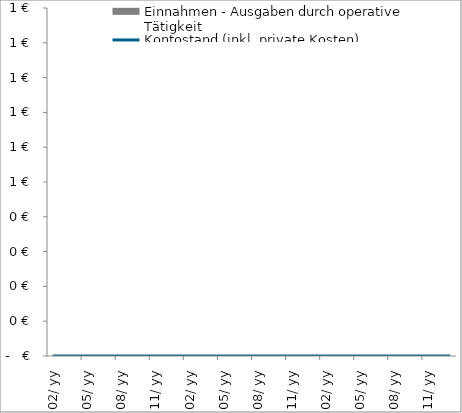
| Category | Einnahmen - Ausgaben durch operative Tätigkeit |
|---|---|
| 2019-02-01 | 0 |
| 2019-03-01 | 0 |
| 2019-04-01 | 0 |
| 2019-05-01 | 0 |
| 2019-06-01 | 0 |
| 2019-07-01 | 0 |
| 2019-08-01 | 0 |
| 2019-09-01 | 0 |
| 2019-10-01 | 0 |
| 2019-11-01 | 0 |
| 2019-12-01 | 0 |
| 2020-01-01 | 0 |
| 2020-02-01 | 0 |
| 2020-03-01 | 0 |
| 2020-04-01 | 0 |
| 2020-05-01 | 0 |
| 2020-06-01 | 0 |
| 2020-07-01 | 0 |
| 2020-08-01 | 0 |
| 2020-09-01 | 0 |
| 2020-10-01 | 0 |
| 2020-11-01 | 0 |
| 2020-12-01 | 0 |
| 2021-01-01 | 0 |
| 2021-02-01 | 0 |
| 2021-03-01 | 0 |
| 2021-04-01 | 0 |
| 2021-05-01 | 0 |
| 2021-06-01 | 0 |
| 2021-07-01 | 0 |
| 2021-08-01 | 0 |
| 2021-09-01 | 0 |
| 2021-10-01 | 0 |
| 2021-11-01 | 0 |
| 2021-12-01 | 0 |
| 2022-01-01 | 0 |